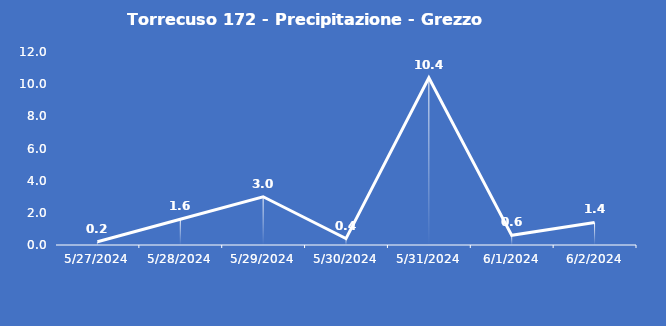
| Category | Torrecuso 172 - Precipitazione - Grezzo (mm) |
|---|---|
| 5/27/24 | 0.2 |
| 5/28/24 | 1.6 |
| 5/29/24 | 3 |
| 5/30/24 | 0.4 |
| 5/31/24 | 10.4 |
| 6/1/24 | 0.6 |
| 6/2/24 | 1.4 |